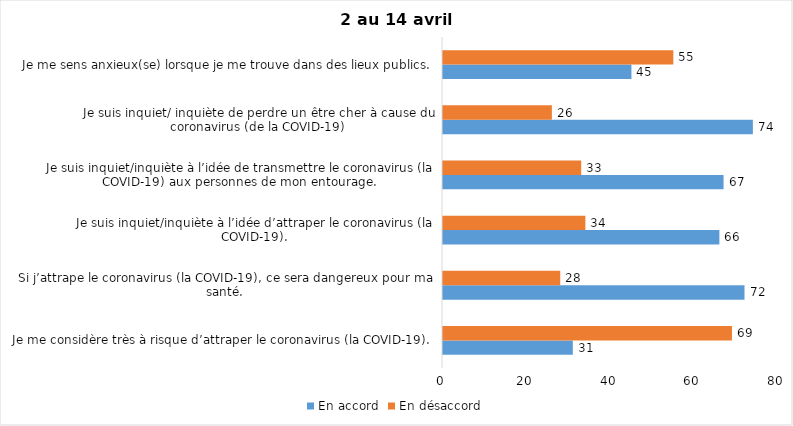
| Category | En accord | En désaccord |
|---|---|---|
| Je me considère très à risque d’attraper le coronavirus (la COVID-19). | 31 | 69 |
| Si j’attrape le coronavirus (la COVID-19), ce sera dangereux pour ma santé. | 72 | 28 |
| Je suis inquiet/inquiète à l’idée d’attraper le coronavirus (la COVID-19). | 66 | 34 |
| Je suis inquiet/inquiète à l’idée de transmettre le coronavirus (la COVID-19) aux personnes de mon entourage. | 67 | 33 |
| Je suis inquiet/ inquiète de perdre un être cher à cause du coronavirus (de la COVID-19) | 74 | 26 |
| Je me sens anxieux(se) lorsque je me trouve dans des lieux publics. | 45 | 55 |